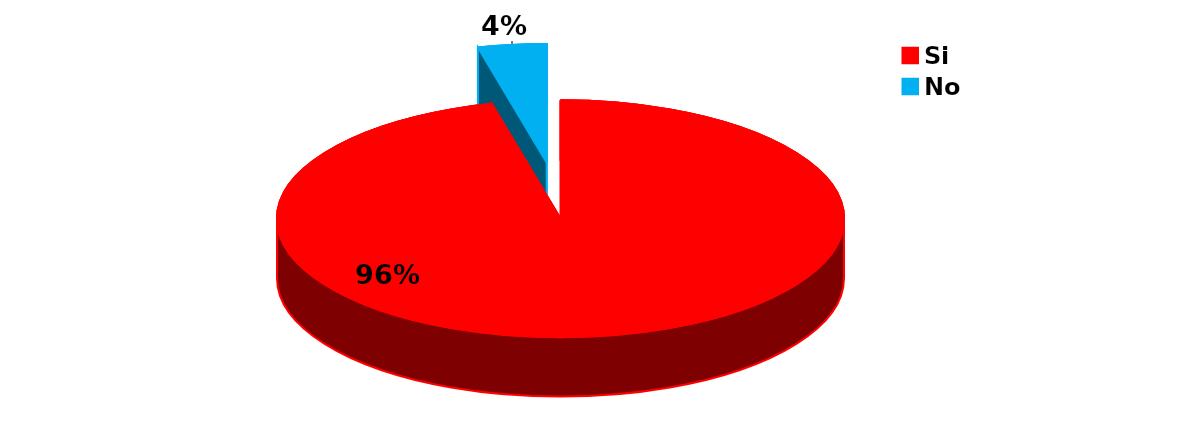
| Category | Series 0 |
|---|---|
| Si | 74 |
| No | 3 |